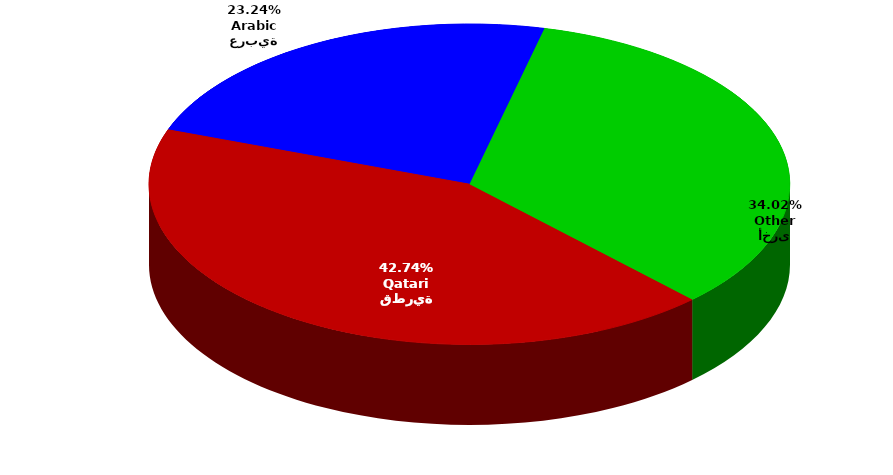
| Category | Series 0 |
|---|---|
| قطرية
Qatari | 395819 |
| عربية
Arabic | 215261 |
| أخرى
Other | 315113 |